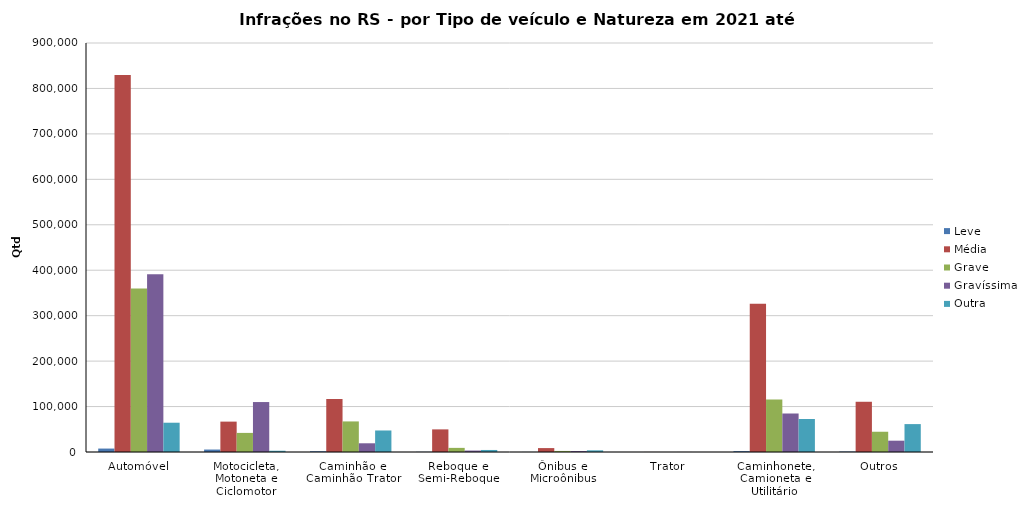
| Category | Leve | Média | Grave | Gravíssima | Outra |
|---|---|---|---|---|---|
| Automóvel | 7565 | 829704 | 359633 | 391086 | 64432 |
| Motocicleta, Motoneta e Ciclomotor | 5408 | 66853 | 42033 | 109920 | 2758 |
| Caminhão e Caminhão Trator | 1593 | 116729 | 67289 | 19183 | 47353 |
| Reboque e Semi-Reboque | 362 | 49774 | 9072 | 3197 | 4477 |
| Ônibus e Microônibus | 127 | 8598 | 2340 | 2190 | 3673 |
| Trator | 2 | 109 | 33 | 77 | 55 |
| Caminhonete, Camioneta e Utilitário | 1938 | 326350 | 115471 | 84721 | 72592 |
| Outros | 962 | 110537 | 44573 | 24901 | 61398 |